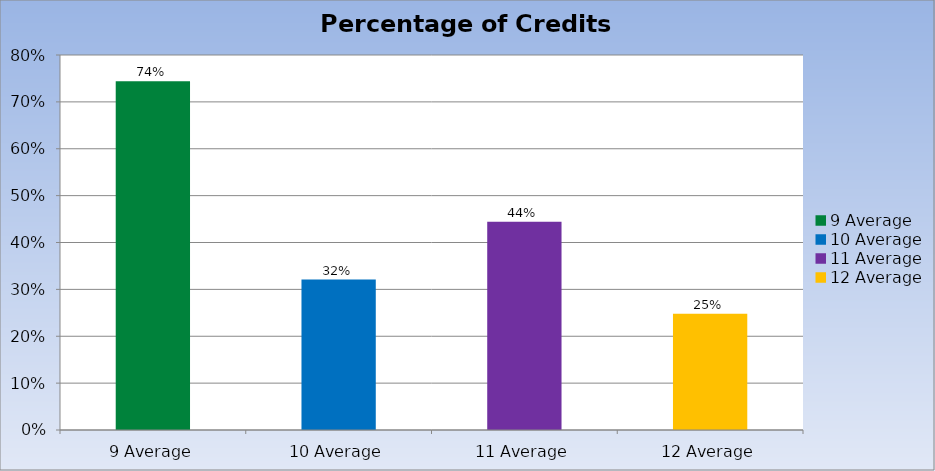
| Category | Percentage of Credits Failed |
|---|---|
| 9 Average | 0.744 |
| 10 Average | 0.321 |
| 11 Average | 0.444 |
| 12 Average | 0.248 |